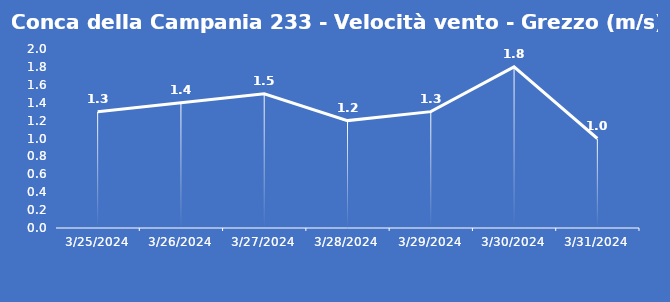
| Category | Conca della Campania 233 - Velocità vento - Grezzo (m/s) |
|---|---|
| 3/25/24 | 1.3 |
| 3/26/24 | 1.4 |
| 3/27/24 | 1.5 |
| 3/28/24 | 1.2 |
| 3/29/24 | 1.3 |
| 3/30/24 | 1.8 |
| 3/31/24 | 1 |